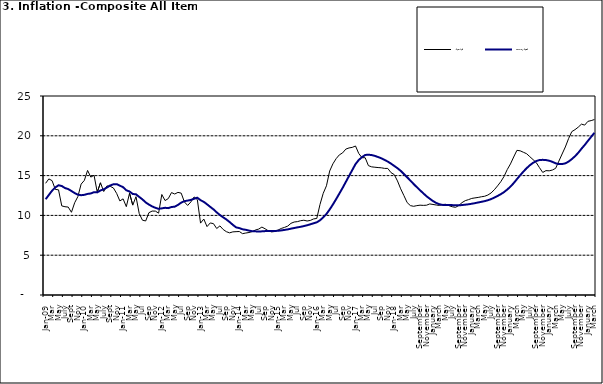
| Category | Year-on Rate | 12-Month Average |
|---|---|---|
| Jan-09 | 14.034 | 12.032 |
| Feb | 14.584 | 12.567 |
| Mar | 14.366 | 13.101 |
| Apr | 13.268 | 13.51 |
| May | 13.212 | 13.787 |
| June | 11.194 | 13.694 |
| July | 11.09 | 13.437 |
| Aug | 11.046 | 13.307 |
| Sept | 10.39 | 13.065 |
| Oct | 11.588 | 12.803 |
| Nov | 12.368 | 12.609 |
| Dec | 13.93 | 12.538 |
| Jan-10 | 14.398 | 12.586 |
| Feb | 15.649 | 12.7 |
| Mar | 14.812 | 12.757 |
| Apr | 15.044 | 12.915 |
| May | 12.915 | 12.893 |
| June | 14.099 | 13.132 |
| July | 13.002 | 13.284 |
| Aug | 13.702 | 13.5 |
| Sept | 13.65 | 13.764 |
| Oct | 13.45 | 13.908 |
| Nov | 12.766 | 13.928 |
| Dec | 11.815 | 13.74 |
| Jan-11 | 12.08 | 13.542 |
| Feb | 11.1 | 13.161 |
| Mar | 12.779 | 13.001 |
| Apr | 11.291 | 12.694 |
| May | 12.352 | 12.648 |
| Jun | 10.23 | 12.321 |
| Jul | 9.397 | 12.009 |
| Aug | 9.301 | 11.635 |
| Sep | 10.339 | 11.363 |
| Oct | 10.544 | 11.13 |
| Nov | 10.54 | 10.952 |
| Dec | 10.283 | 10.826 |
| Jan-12 | 12.626 | 10.886 |
| Feb | 11.866 | 10.955 |
| Mar | 12.111 | 10.914 |
| Apr | 12.866 | 11.054 |
| May | 12.688 | 11.096 |
| Jun | 12.892 | 11.32 |
| Jul | 12.797 | 11.599 |
| Aug | 11.689 | 11.791 |
| Sep | 11.253 | 11.859 |
| Oct | 11.693 | 11.948 |
| Nov | 12.32 | 12.091 |
| Dec | 11.981 | 12.224 |
| Jan-13 | 9.031 | 11.908 |
| Feb | 9.542 | 11.703 |
| Mar | 8.593 | 11.394 |
| Apr | 9.052 | 11.072 |
| May | 8.964 | 10.761 |
| Jun | 8.353 | 10.383 |
| Jul | 8.682 | 10.047 |
| Aug | 8.231 | 9.761 |
| Sep | 7.952 | 9.486 |
| Oct | 7.807 | 9.167 |
| Nov | 7.931 | 8.815 |
| Dec | 7.957 | 8.496 |
| Jan-14 | 7.977 | 8.408 |
| Feb | 7.707 | 8.257 |
| Mar | 7.783 | 8.19 |
| Apr | 7.851 | 8.092 |
| May | 7.965 | 8.012 |
| Jun | 8.167 | 7.998 |
| Jul | 8.281 | 7.968 |
| Aug | 8.534 | 7.996 |
| Sep | 8.317 | 8.027 |
| Oct | 8.06 | 8.047 |
| Nov | 7.927 | 8.046 |
| Dec | 7.978 | 8.047 |
| Jan-15 | 8.157 | 8.063 |
| Feb | 8.359 | 8.117 |
| Mar | 8.494 | 8.176 |
| Apr | 8.655 | 8.243 |
| May | 9.003 | 8.331 |
| Jun | 9.168 | 8.417 |
| Jul | 9.218 | 8.497 |
| Aug | 9.336 | 8.566 |
| Sep | 9.394 | 8.658 |
| Oct | 9.296 | 8.76 |
| Nov | 9.368 | 8.879 |
| Dec | 9.554 | 9.009 |
| Jan-16 | 9.617 | 9.13 |
| Feb | 11.379 | 9.386 |
| Mar | 12.775 | 9.751 |
| Apr | 13.721 | 10.182 |
| May | 15.577 | 10.746 |
| Jun | 16.48 | 11.372 |
| Jul | 17.127 | 12.045 |
| Aug | 17.609 | 12.744 |
| Sep | 17.852 | 13.454 |
| Oct | 18.33 | 14.206 |
| Nov | 18.476 | 14.958 |
| Dec | 18.547 | 15.697 |
| Jan-17 | 18.719 | 16.441 |
| Feb | 17.78 | 16.958 |
| Mar | 17.256 | 17.315 |
| Apr | 17.244 | 17.591 |
| May | 16.251 | 17.628 |
| Jun | 16.098 | 17.578 |
| Jul | 16.053 | 17.475 |
| Aug | 16.012 | 17.331 |
| Sep | 15.979 | 17.17 |
| Oct | 15.905 | 16.968 |
| Nov | 15.901 | 16.76 |
| Dec | 15.372 | 16.502 |
| Jan-18 | 15.127 | 16.215 |
| Feb | 14.33 | 15.93 |
| Mar | 13.337 | 15.599 |
| Apr | 12.482 | 15.196 |
| May | 11.608 | 14.793 |
| June | 11.231 | 14.371 |
| July | 11.142 | 13.95 |
| August | 11.227 | 13.546 |
| September | 11.284 | 13.157 |
| October | 11.259 | 12.777 |
| November | 11.281 | 12.406 |
| December | 11.442 | 12.095 |
| January | 11.374 | 11.801 |
| February | 11.306 | 11.564 |
| March | 11.251 | 11.401 |
| April | 11.372 | 11.314 |
| May | 11.396 | 11.299 |
| June | 11.217 | 11.297 |
| July | 11.084 | 11.291 |
| August | 11.016 | 11.271 |
| September | 11.244 | 11.268 |
| October | 11.607 | 11.298 |
| November | 11.854 | 11.348 |
| December | 11.982 | 11.396 |
| January | 12.132 | 11.462 |
| February | 12.199 | 11.539 |
| March | 12.257 | 11.624 |
| April | 12.341 | 11.706 |
| May | 12.404 | 11.791 |
| June | 12.559 | 11.904 |
| July | 12.821 | 12.049 |
| August | 13.22 | 12.233 |
| September | 13.707 | 12.44 |
| October | 14.233 | 12.664 |
| November | 14.887 | 12.923 |
| December | 15.753 | 13.246 |
| January | 16.466 | 13.616 |
| February | 17.335 | 14.053 |
| March | 18.171 | 14.554 |
| April | 18.117 | 15.039 |
| May | 17.933 | 15.499 |
| June | 17.751 | 15.927 |
| July | 17.377 | 16.298 |
| August | 17.009 | 16.601 |
| September | 16.63 | 16.83 |
| October | 15.994 | 16.958 |
| November | 15.396 | 16.979 |
| December | 15.625 | 16.953 |
| January | 15.601 | 16.869 |
| February | 15.702 | 16.728 |
| March | 15.915 | 16.544 |
| April | 16.819 | 16.449 |
| May | 17.712 | 16.449 |
| June | 18.596 | 16.542 |
| July | 19.643 | 16.755 |
| August | 20.525 | 17.07 |
| September | 20.774 | 17.432 |
| October | 21.087 | 17.865 |
| November | 21.466 | 18.372 |
| December | 21.344 | 18.847 |
| January | 21.816 | 19.362 |
| February | 21.91 | 19.873 |
| March | 22.043 | 20.375 |